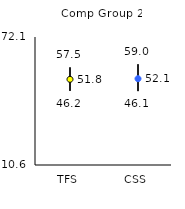
| Category | 25th | 75th | Mean |
|---|---|---|---|
| TFS | 46.2 | 57.5 | 51.76 |
| CSS | 46.1 | 59 | 52.07 |